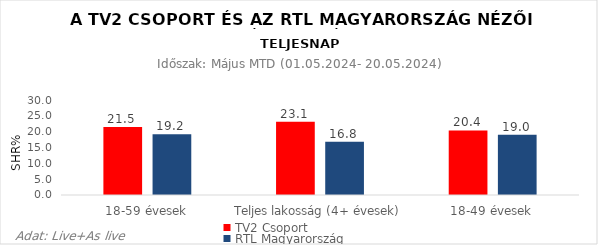
| Category | TV2 Csoport | RTL Magyarország |
|---|---|---|
| 18-59 évesek | 21.5 | 19.2 |
| Teljes lakosság (4+ évesek) | 23.1 | 16.8 |
| 18-49 évesek | 20.4 | 19 |